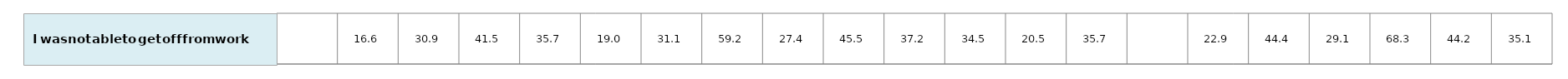
| Category | Series 0 |
|---|---|
| nan | 1 |
| 16.56057219644432 | 1 |
| 30.90787365923245 | 1 |
| 41.53067560870644 | 1 |
| 35.72874518715372 | 1 |
| 19.01540089532927 | 1 |
| 31.10133633977808 | 1 |
| 59.151892476881095 | 1 |
| 27.379469578067962 | 1 |
| 45.517508716819535 | 1 |
| 37.21244416317602 | 1 |
| 34.45869273152142 | 1 |
| 20.504529926167052 | 1 |
| 35.72467848012063 | 1 |
| nan | 1 |
| 22.922638520782453 | 1 |
| 44.3538854424137 | 1 |
| 29.079491733953112 | 1 |
| 68.27760757160259 | 1 |
| 44.20779491667267 | 1 |
| 35.133652977469545 | 1 |